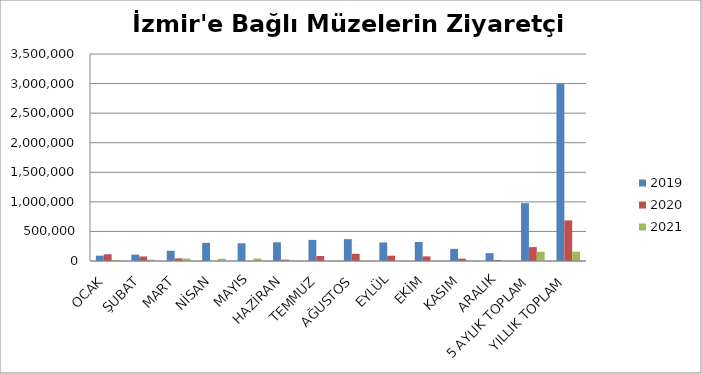
| Category | 2019 | 2020 | 2021 |
|---|---|---|---|
| OCAK | 90406 | 113675 | 14992 |
| ŞUBAT | 108321 | 76403 | 21877 |
| MART | 173542 | 44613 | 40903 |
| NİSAN | 306745 | 0 | 38306 |
| MAYIS | 299441 | 0 | 40946 |
| HAZİRAN | 316361 | 22885 | 0 |
| TEMMUZ | 356504 | 84548 | 0 |
| AĞUSTOS | 369370 | 121753 | 0 |
| EYLÜL | 313284 | 89757 | 0 |
| EKİM | 321498 | 78061 | 0 |
| KASIM | 205258 | 39134 | 0 |
| ARALIK | 131881 | 16010 | 0 |
| 5 AYLIK TOPLAM | 978455 | 234691 | 157024 |
| YILLIK TOPLAM | 2992611 | 686839 | 157024 |